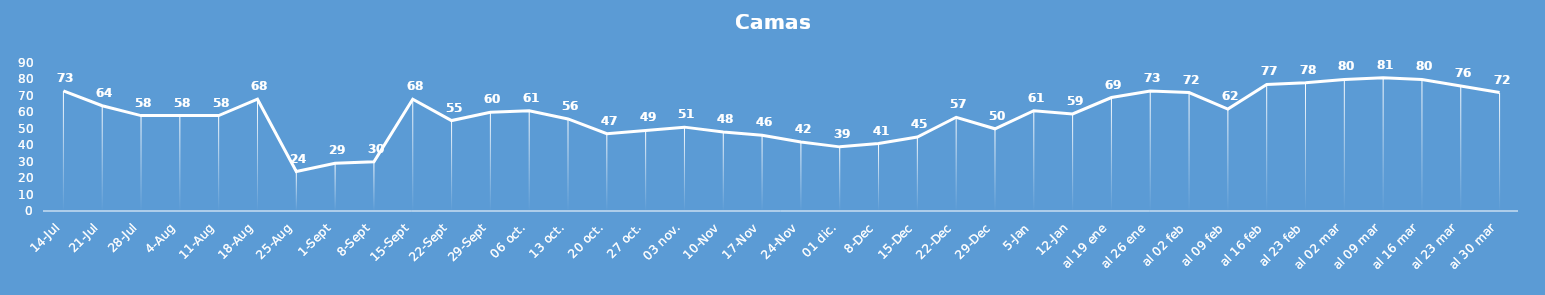
| Category | Series 1 |
|---|---|
| 14-Jul | 73 |
| 21-Jul | 64 |
| 28-Jul | 58 |
| 4-Ago | 58 |
| 11-Ago | 58 |
| 18-Ago | 68 |
| 25-Ago | 24 |
| 1-Set | 29 |
| 8-Set | 30 |
| 15-Set | 68 |
| 22-Set | 55 |
| 29-Set | 60 |
| 06 oct. | 61 |
| 13 oct. | 56 |
| 20 oct. | 47 |
| 27 oct. | 49 |
| 03 nov. | 51 |
| 10-Nov | 48 |
| 17-Nov | 46 |
| 24-Nov | 42 |
|  01 dic. | 39 |
| 8-Dic | 41 |
| 15-Dic | 45 |
| 22-Dic | 57 |
| 29-Dic | 50 |
| 5-Ene | 61 |
| 12-Ene | 59 |
| al 19 ene | 69 |
| al 26 ene | 73 |
| al 02 feb | 72 |
| al 09 feb | 62 |
| al 16 feb | 77 |
| al 23 feb | 78 |
| al 02 mar | 80 |
| al 09 mar | 81 |
| al 16 mar | 80 |
| al 23 mar | 76 |
| al 30 mar | 72 |